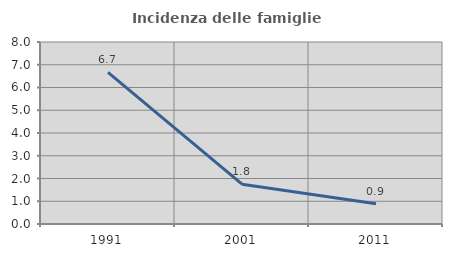
| Category | Incidenza delle famiglie numerose |
|---|---|
| 1991.0 | 6.667 |
| 2001.0 | 1.751 |
| 2011.0 | 0.893 |